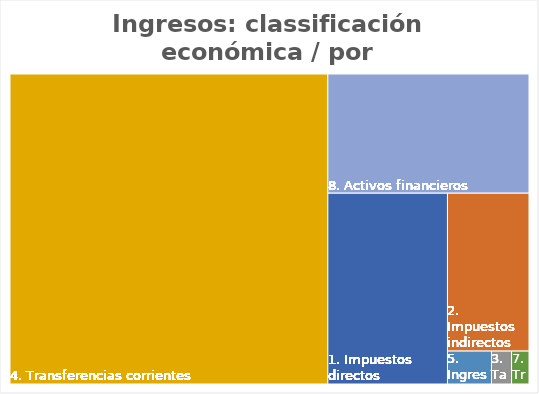
| Category | Series 0 |
|---|---|
| 1. Impuestos directos | 0.142 |
| 2. Impuestos indirectos | 0.08 |
| 3. Tasas, precios públicos y otros ing. | 0.004 |
| 4. Transferencias corrientes | 0.612 |
| 5. Ingresos patrimoniales | 0.009 |
| 7. Transferencias de capital | 0.004 |
| 8. Activos financieros | 0.149 |